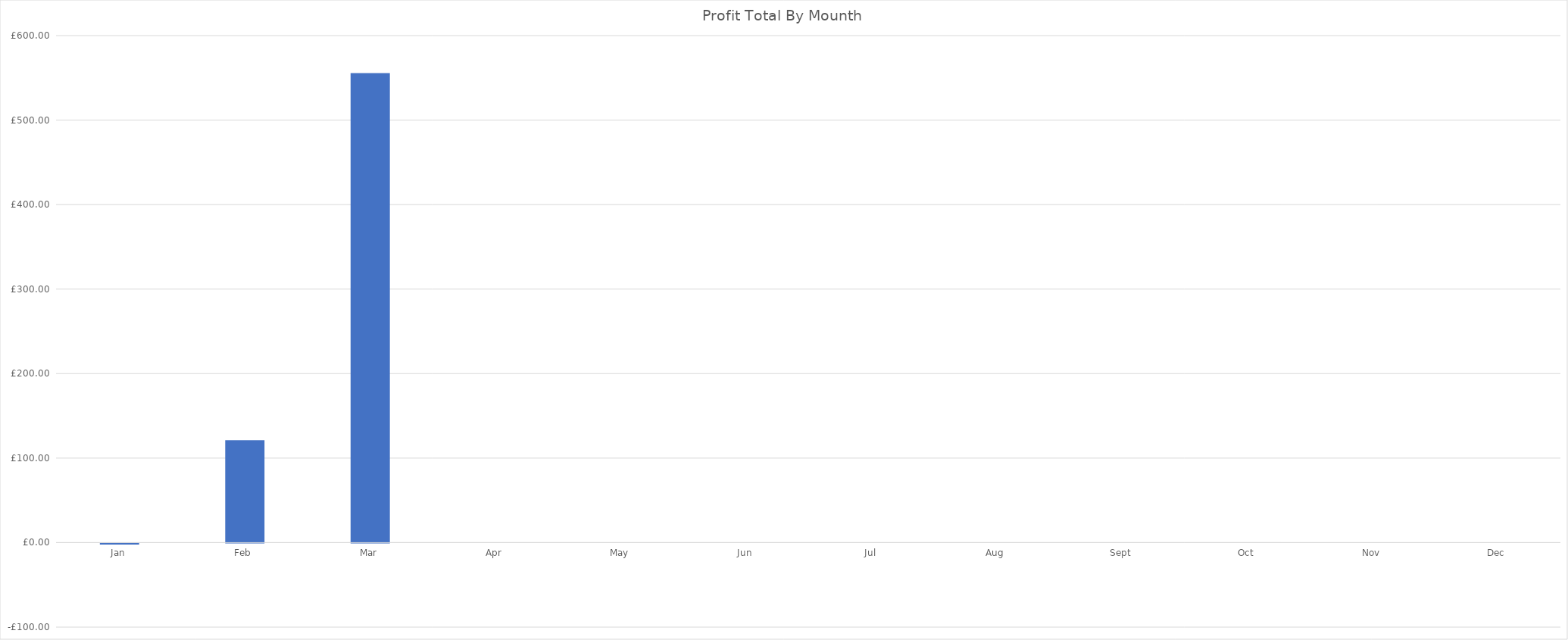
| Category | Profit Total By Mounth |
|---|---|
| 2021-01-01 | -1.4 |
| 2021-02-01 | 121.23 |
| 2021-03-01 | 555.72 |
| 2021-04-01 | 0 |
| 2021-05-01 | 0 |
| 2021-06-01 | 0 |
| 2021-07-01 | 0 |
| 2021-08-01 | 0 |
| 2021-09-01 | 0 |
| 2021-10-01 | 0 |
| 2021-11-01 | 0 |
| 2021-12-01 | 0 |